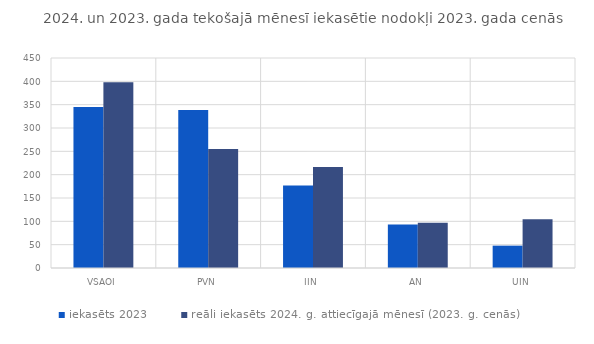
| Category | iekasēts 2023 | reāli iekasēts 2024. g. attiecīgajā mēnesī (2023. g. cenās) |
|---|---|---|
| VSAOI | 344.906 | 398.268 |
| PVN | 338.499 | 255.195 |
| IIN | 176.948 | 216.41 |
| AN | 93.144 | 97.12 |
| UIN | 47.876 | 104.556 |